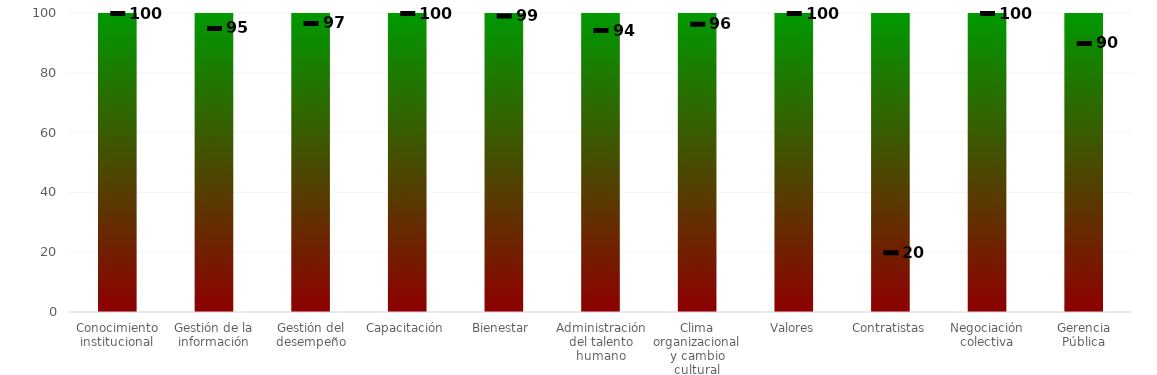
| Category | Niveles |
|---|---|
| Conocimiento institucional | 100 |
| Gestión de la información | 100 |
| Gestión del desempeño | 100 |
| Capacitación | 100 |
| Bienestar  | 100 |
| Administración del talento humano | 100 |
| Clima organizacional y cambio cultural | 100 |
| Valores | 100 |
| Contratistas | 100 |
| Negociación colectiva | 100 |
| Gerencia Pública | 100 |